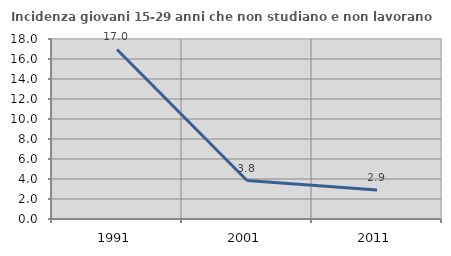
| Category | Incidenza giovani 15-29 anni che non studiano e non lavorano  |
|---|---|
| 1991.0 | 16.957 |
| 2001.0 | 3.846 |
| 2011.0 | 2.899 |